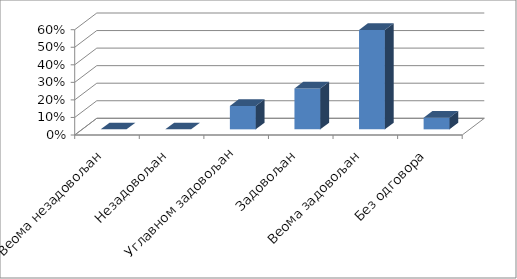
| Category | Series 0 |
|---|---|
| Веома незадовољан | 0 |
| Незадовољан | 0 |
| Углавном задовољан | 0.133 |
| Задовољан | 0.233 |
| Веома задовољан | 0.567 |
| Без одговора | 0.067 |